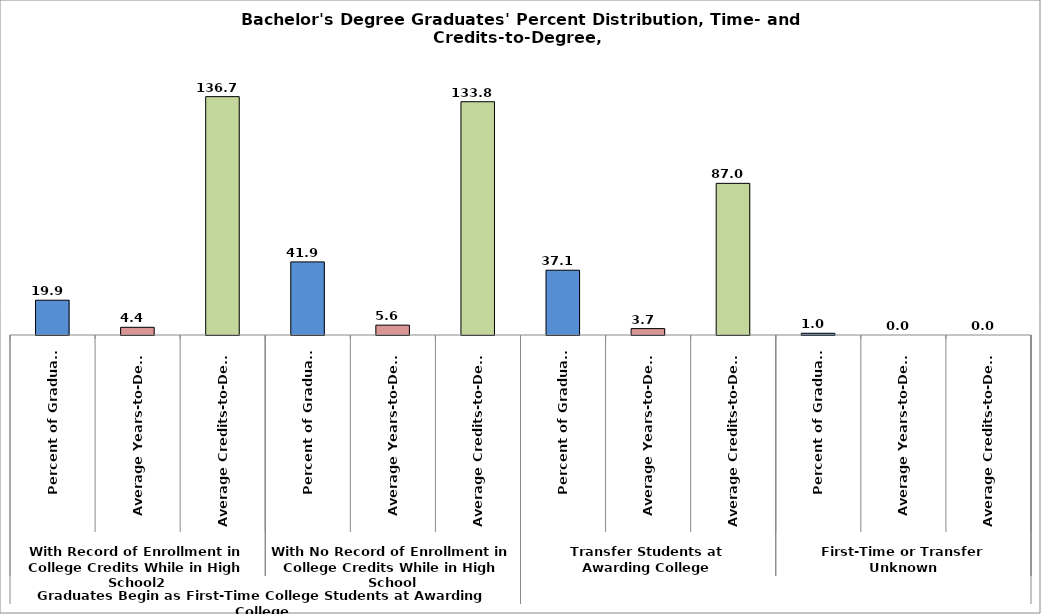
| Category | Series 0 |
|---|---|
| 0 | 19.949 |
| 1 | 4.413 |
| 2 | 136.688 |
| 3 | 41.922 |
| 4 | 5.649 |
| 5 | 133.778 |
| 6 | 37.145 |
| 7 | 3.66 |
| 8 | 86.968 |
| 9 | 0.984 |
| 10 | 0 |
| 11 | 0 |